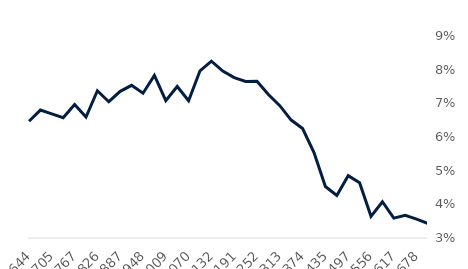
| Category | Full market |
|---|---|
| 2016-10-01 | 0.065 |
| 2016-11-01 | 0.068 |
| 2016-12-01 | 0.067 |
| 2017-01-01 | 0.066 |
| 2017-02-01 | 0.07 |
| 2017-03-01 | 0.066 |
| 2017-04-01 | 0.074 |
| 2017-05-01 | 0.07 |
| 2017-06-01 | 0.074 |
| 2017-07-01 | 0.075 |
| 2017-08-01 | 0.073 |
| 2017-09-01 | 0.078 |
| 2017-10-01 | 0.071 |
| 2017-11-01 | 0.075 |
| 2017-12-01 | 0.071 |
| 2018-01-01 | 0.08 |
| 2018-02-01 | 0.083 |
| 2018-03-01 | 0.08 |
| 2018-04-01 | 0.078 |
| 2018-05-01 | 0.076 |
| 2018-06-01 | 0.077 |
| 2018-07-01 | 0.073 |
| 2018-08-01 | 0.069 |
| 2018-09-01 | 0.065 |
| 2018-10-01 | 0.063 |
| 2018-11-01 | 0.055 |
| 2018-12-01 | 0.045 |
| 2019-01-01 | 0.043 |
| 2019-02-01 | 0.049 |
| 2019-03-01 | 0.046 |
| 2019-04-01 | 0.036 |
| 2019-05-01 | 0.041 |
| 2019-06-01 | 0.036 |
| 2019-07-01 | 0.037 |
| 2019-08-01 | 0.036 |
| 2019-09-01 | 0.034 |